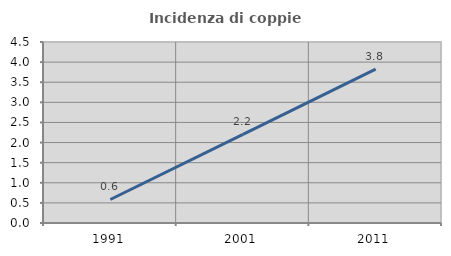
| Category | Incidenza di coppie miste |
|---|---|
| 1991.0 | 0.585 |
| 2001.0 | 2.204 |
| 2011.0 | 3.825 |